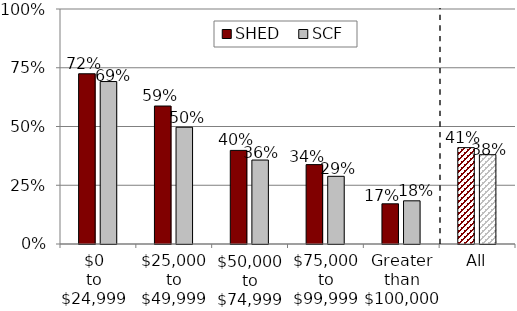
| Category | SHED | SCF |
|---|---|---|
| $0 to $24,999 | 0.724 | 0.691 |
| $25,000 to $49,999 | 0.587 | 0.497 |
| $50,000 to $74,999 | 0.398 | 0.357 |
| $75,000 to $99,999 | 0.338 | 0.288 |
| Greater than $100,000 | 0.171 | 0.184 |
| All | 0.41 | 0.38 |